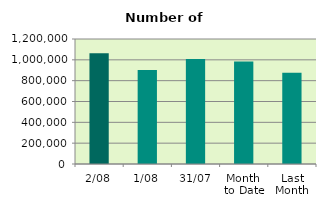
| Category | Series 0 |
|---|---|
| 2/08 | 1063042 |
| 1/08 | 903192 |
| 31/07 | 1007852 |
| Month 
to Date | 983117 |
| Last
Month | 877151.619 |